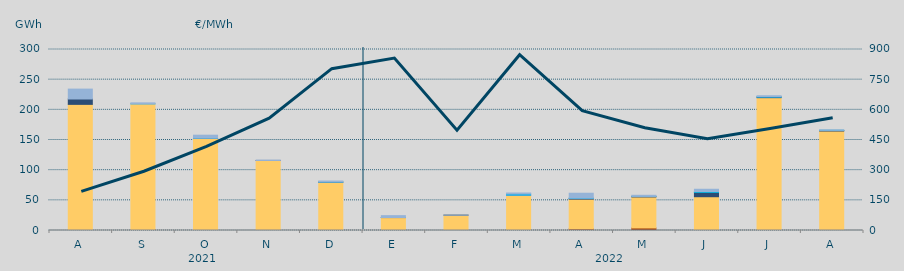
| Category | Carbón | Ciclo Combinado | Cogeneración | Consumo Bombeo | Enlace Península Baleares | Eólica | Hidráulica | Internacionales | Otras Renovables | Residuos no Renovables | Solar fotovoltaica | Solar térmica | Turbinación bombeo |
|---|---|---|---|---|---|---|---|---|---|---|---|---|---|
| A | 0 | 209052.1 | 0 | 8918.2 | 0 | 0 | 0 | 0 | 0 | 0 | 0 | 0 | 16379.8 |
| S | 1190 | 208735.2 | 0 | 0 | 0 | 0 | 34.4 | 0 | 0 | 0 | 0 | 0 | 1592.2 |
| O | 1340 | 151473.6 | 0 | 156.2 | 0 | 0 | 130 | 0 | 0 | 0 | 0 | 0 | 4869.5 |
| N | 165 | 115928.8 | 0 | 16.1 | 30.6 | 0 | 0 | 0 | 0 | 0 | 0 | 0 | 373.4 |
| D | 0 | 79972.3 | 0 | 260.2 | 0 | 0 | 196.2 | 0 | 0 | 0 | 0 | 0 | 1577.4 |
| E | 0 | 21421.9 | 0 | 131 | 0 | 0 | 11.7 | 0 | 0 | 0 | 0 | 0 | 3055.8 |
| F | 0 | 25414.5 | 0 | 90.9 | 0 | 0 | 0 | 0 | 0 | 0 | 0 | 0 | 102.5 |
| M | 0 | 58378.9 | 0 | 0 | 204 | 0 | 2030 | 0 | 0 | 0 | 0 | 0 | 1537.1 |
| A | 2650 | 49297.5 | 0 | 1035.9 | 250 | 0 | 506.1 | 0 | 0 | 0 | 0 | 0 | 8012.5 |
| M | 4151 | 51455.8 | 0 | 906.775 | 0 | 0 | 22.4 | 0 | 0 | 0 | 0 | 0 | 1817.044 |
| J | 865 | 55112.458 | 0 | 7229.298 | 0 | 0.5 | 1411.333 | 0 | 0 | 0 | 0 | 0 | 3733.801 |
| J | 60 | 220106.232 | 0 | 916.465 | 0 | 0 | 693.475 | 0 | 0 | 0 | 0 | 0 | 1555.3 |
| A | 115 | 164760.775 | 0 | 1020.576 | 102 | 0 | 100 | 0 | 0 | 0 | 0 | 0 | 81.25 |